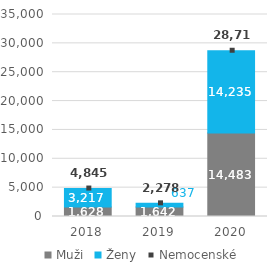
| Category | Muži | Ženy |
|---|---|---|
| 0 | 1627.667 | 3216.917 |
| 1 | 1641.667 | 636.583 |
| 2 | 14482.727 | 14234.636 |